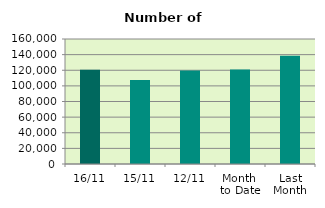
| Category | Series 0 |
|---|---|
| 16/11 | 120494 |
| 15/11 | 107592 |
| 12/11 | 119714 |
| Month 
to Date | 120818.833 |
| Last
Month | 138693.238 |